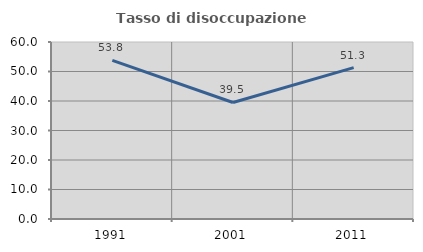
| Category | Tasso di disoccupazione giovanile  |
|---|---|
| 1991.0 | 53.785 |
| 2001.0 | 39.496 |
| 2011.0 | 51.304 |